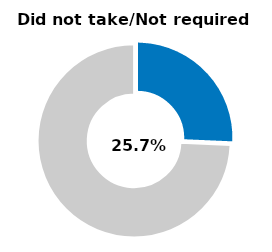
| Category | Series 0 |
|---|---|
| Did not take/not required | 0.257 |
| Other | 0.743 |